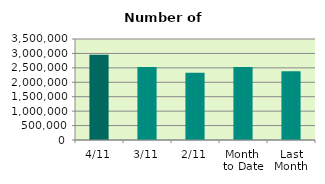
| Category | Series 0 |
|---|---|
| 4/11 | 2950914 |
| 3/11 | 2526856 |
| 2/11 | 2327116 |
| Month 
to Date | 2532269.5 |
| Last
Month | 2382963.143 |